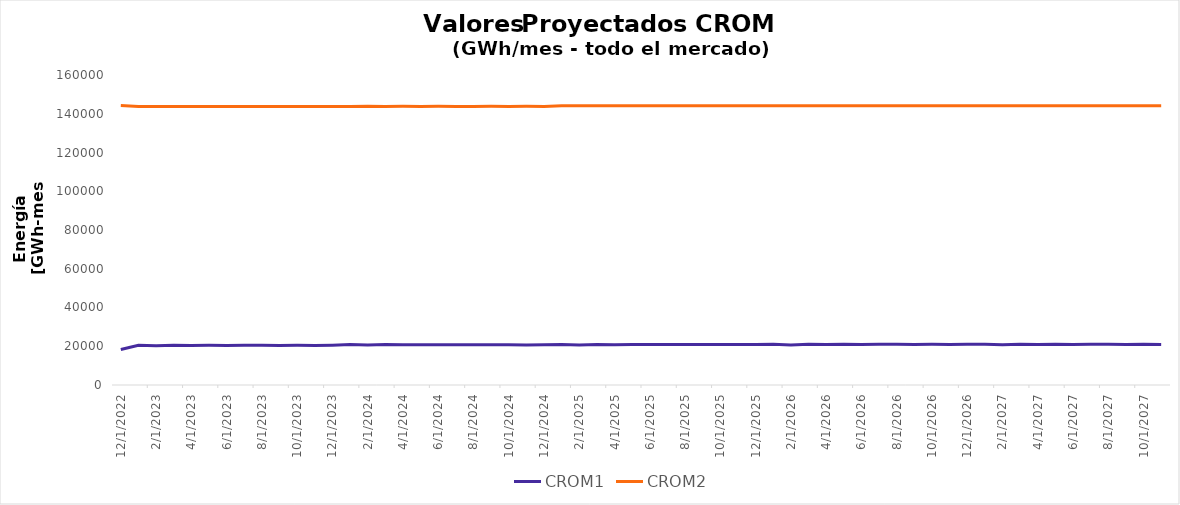
| Category | CROM1 | CROM2 |
|---|---|---|
| 12/1/22 | 18283.217 | 144211.932 |
| 1/1/23 | 20520.738 | 143723.719 |
| 2/1/23 | 20246.722 | 143756.873 |
| 3/1/23 | 20532.185 | 143718.754 |
| 4/1/23 | 20420.884 | 143735.601 |
| 5/1/23 | 20460.539 | 143738.548 |
| 6/1/23 | 20381.741 | 143748.422 |
| 7/1/23 | 20505.436 | 143738.028 |
| 8/1/23 | 20500.371 | 143737.378 |
| 9/1/23 | 20419.608 | 143747.884 |
| 10/1/23 | 20486.932 | 143735.859 |
| 11/1/23 | 20371.33 | 143736.233 |
| 12/1/23 | 20517.366 | 143722.148 |
| 1/1/24 | 20850.582 | 143763.704 |
| 2/1/24 | 20640.849 | 143893.879 |
| 3/1/24 | 20844.031 | 143799.681 |
| 4/1/24 | 20745.695 | 143886.645 |
| 5/1/24 | 20828.51 | 143803.712 |
| 6/1/24 | 20718.658 | 143890.5 |
| 7/1/24 | 20810.843 | 143805.933 |
| 8/1/24 | 20803.069 | 143803.422 |
| 9/1/24 | 20712.286 | 143886.783 |
| 10/1/24 | 20810.154 | 143800.065 |
| 11/1/24 | 20706.942 | 143886.098 |
| 12/1/24 | 20825.655 | 143801.261 |
| 1/1/25 | 20944.915 | 144162.703 |
| 2/1/25 | 20622.841 | 144170.031 |
| 3/1/25 | 20937.266 | 144162.343 |
| 4/1/25 | 20836.169 | 144162.711 |
| 5/1/25 | 20947.151 | 144162.97 |
| 6/1/25 | 20845.555 | 144163.349 |
| 7/1/25 | 20947.111 | 144163.14 |
| 8/1/25 | 20942.349 | 144163.229 |
| 9/1/25 | 20840.065 | 144162.831 |
| 10/1/25 | 20943.709 | 144162.458 |
| 11/1/25 | 20842.353 | 144162.609 |
| 12/1/25 | 20918.407 | 144161.853 |
| 1/1/26 | 20996.057 | 144161.181 |
| 2/1/26 | 20683.563 | 144161.179 |
| 3/1/26 | 20994.267 | 144160.708 |
| 4/1/26 | 20888.953 | 144161.244 |
| 5/1/26 | 20993.033 | 144161.418 |
| 6/1/26 | 20888.474 | 144161.841 |
| 7/1/26 | 20987.109 | 144161.584 |
| 8/1/26 | 20984.757 | 144161.779 |
| 9/1/26 | 20879.531 | 144161.222 |
| 10/1/26 | 20975.531 | 144160.836 |
| 11/1/26 | 20873.936 | 144161.013 |
| 12/1/26 | 20970.078 | 144160.154 |
| 1/1/27 | 21060.352 | 144161.609 |
| 2/1/27 | 20735.182 | 144162.255 |
| 3/1/27 | 21059.525 | 144161.822 |
| 4/1/27 | 20960.162 | 144162.454 |
| 5/1/27 | 21066.529 | 144162.534 |
| 6/1/27 | 20959.084 | 144162.96 |
| 7/1/27 | 21063.109 | 144162.715 |
| 8/1/27 | 21055.646 | 144162.986 |
| 9/1/27 | 20953.754 | 144162.495 |
| 10/1/27 | 21059.675 | 144161.929 |
| 11/1/27 | 20953.94 | 144162.089 |